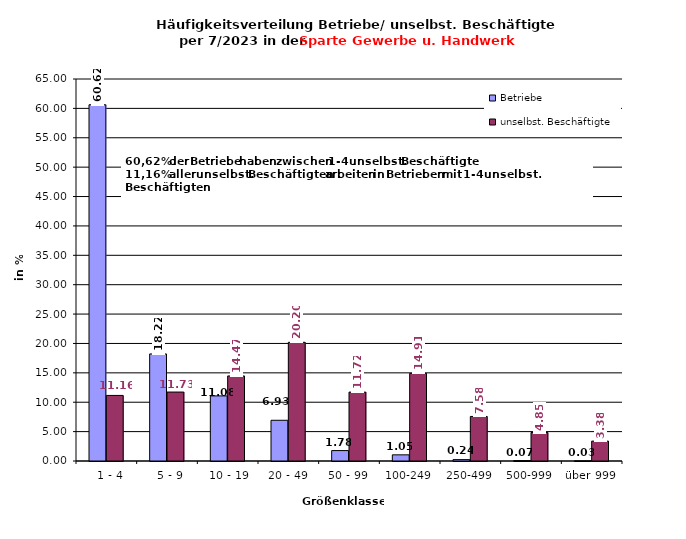
| Category | Betriebe | unselbst. Beschäftigte |
|---|---|---|
|   1 - 4 | 60.618 | 11.157 |
|   5 - 9 | 18.217 | 11.731 |
|  10 - 19 | 11.077 | 14.472 |
| 20 - 49 | 6.93 | 20.197 |
| 50 - 99 | 1.775 | 11.721 |
| 100-249 | 1.048 | 14.908 |
| 250-499 | 0.236 | 7.582 |
| 500-999 | 0.072 | 4.849 |
| über 999 | 0.026 | 3.384 |